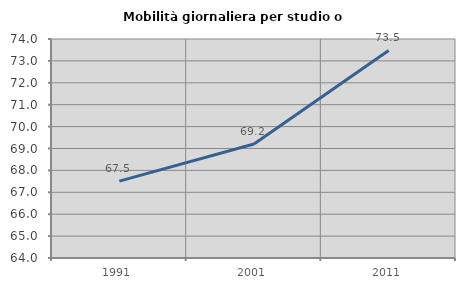
| Category | Mobilità giornaliera per studio o lavoro |
|---|---|
| 1991.0 | 67.508 |
| 2001.0 | 69.207 |
| 2011.0 | 73.478 |